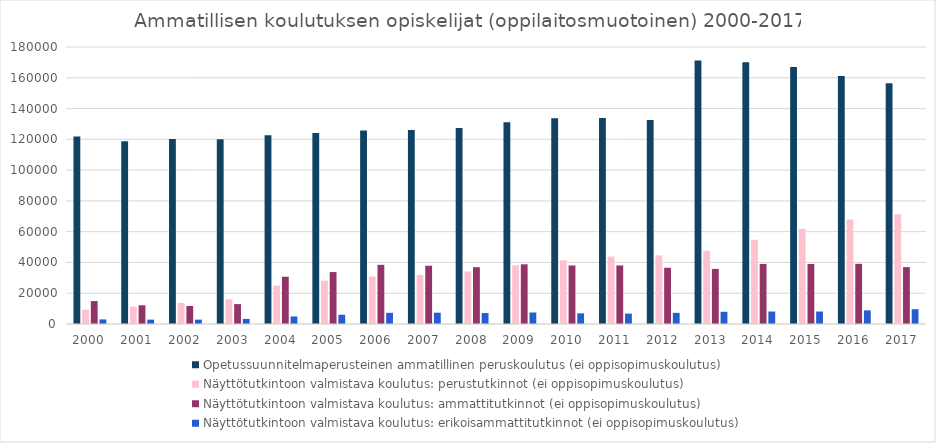
| Category | Opetussuunnitelmaperusteinen ammatillinen peruskoulutus (ei oppisopimuskoulutus) | Näyttötutkintoon valmistava koulutus: perustutkinnot (ei oppisopimuskoulutus) | Näyttötutkintoon valmistava koulutus: ammattitutkinnot (ei oppisopimuskoulutus) | Näyttötutkintoon valmistava koulutus: erikoisammattitutkinnot (ei oppisopimuskoulutus) |
|---|---|---|---|---|
| 2000 | 121812 | 9279 | 14888 | 2965 |
| 2001 | 118679 | 11325 | 12177 | 2838 |
| 2002 | 120217 | 13655 | 11687 | 2840 |
| 2003 | 120111 | 16098 | 12938 | 3313 |
| 2004 | 122607 | 24914 | 30716 | 4901 |
| 2005 | 124188 | 28140 | 33752 | 6011 |
| 2006 | 125674 | 30862 | 38445 | 7259 |
| 2007 | 126085 | 31890 | 37864 | 7345 |
| 2008 | 127284 | 34150 | 36922 | 7105 |
| 2009 | 131175 | 38148 | 38791 | 7461 |
| 2010 | 133770 | 41419 | 38021 | 6951 |
| 2011 | 133794 | 43790 | 38047 | 6759 |
| 2012 | 132554 | 44565 | 36558 | 7240 |
| 2013 | 171198 | 47572 | 35804 | 7932 |
| 2014 | 170026 | 54695 | 39051 | 8108 |
| 2015 | 166967 | 61887 | 39023 | 8106 |
| 2016 | 161148 | 67815 | 39111 | 8872 |
| 2017 | 156427 | 71257 | 36952 | 9601 |